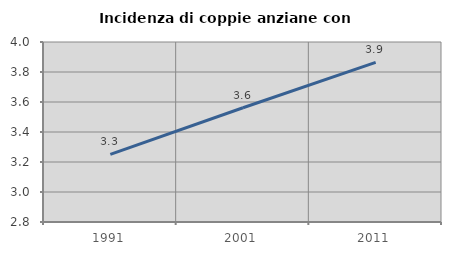
| Category | Incidenza di coppie anziane con figli |
|---|---|
| 1991.0 | 3.251 |
| 2001.0 | 3.562 |
| 2011.0 | 3.864 |